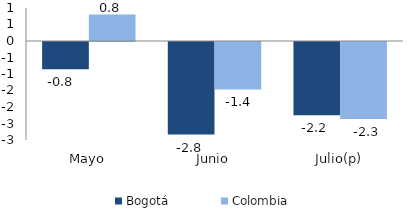
| Category | Bogotá | Colombia |
|---|---|---|
| Mayo | -0.828 | 0.803 |
| Junio | -2.803 | -1.439 |
| Julio(p) | -2.217 | -2.333 |